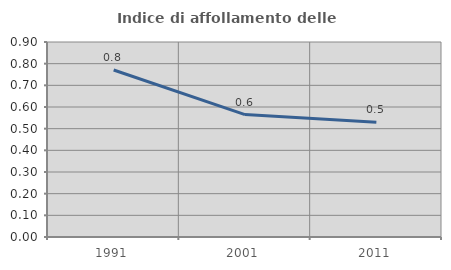
| Category | Indice di affollamento delle abitazioni  |
|---|---|
| 1991.0 | 0.771 |
| 2001.0 | 0.565 |
| 2011.0 | 0.529 |